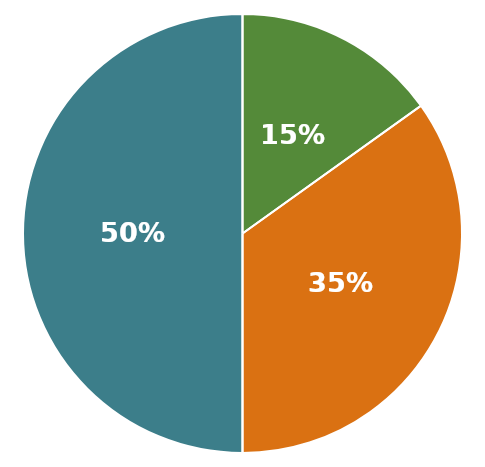
| Category | Ergebnis Anlagevermögen |
|---|---|
| 0 | 1902500 |
| 1 | 575000 |
| 2 | 1327500 |